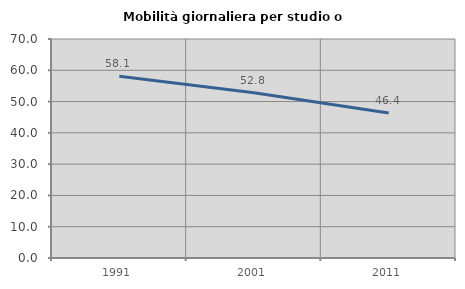
| Category | Mobilità giornaliera per studio o lavoro |
|---|---|
| 1991.0 | 58.106 |
| 2001.0 | 52.83 |
| 2011.0 | 46.365 |